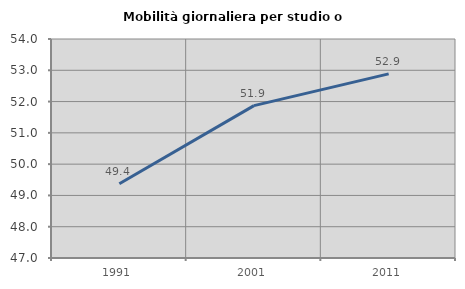
| Category | Mobilità giornaliera per studio o lavoro |
|---|---|
| 1991.0 | 49.372 |
| 2001.0 | 51.869 |
| 2011.0 | 52.885 |